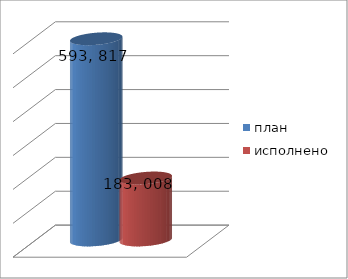
| Category | план | исполнено |
|---|---|---|
| 0 | 593817722.8 | 183008779.89 |